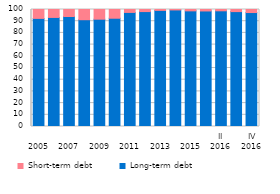
| Category | Long-term debt | Short-term debt |
|---|---|---|
| 
2005 | 92.404 | 7.596 |
| 
2006 | 93.225 | 6.775 |
| 
2007 | 93.994 | 6.006 |
| 
2008 | 91.269 | 8.731 |
| 
2009 | 91.724 | 8.276 |
| 
2010 | 92.547 | 7.453 |
| 
2011 | 97.51 | 2.49 |
| 
2012 | 98.226 | 1.774 |
| 
2013 | 99.234 | 0.766 |
| 
2014 | 99.616 | 0.384 |
| 
2015 | 98.844 | 1.156 |
| I
2016 | 98.749 | 1.251 |
| II
2016 | 98.887 | 1.113 |
| III
2016 | 98.201 | 1.799 |
| IV
2016 | 97.406 | 2.594 |